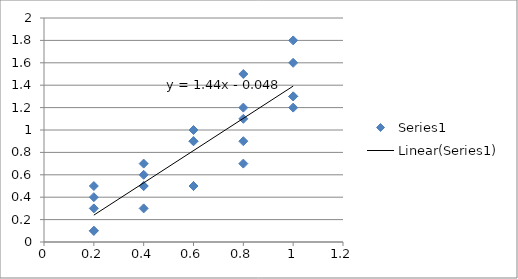
| Category | Series 0 |
|---|---|
| 0.2 | 0.4 |
| 0.4 | 0.3 |
| 0.6000000000000001 | 0.9 |
| 0.8 | 1.1 |
| 1.0 | 1.3 |
| 0.2 | 0.5 |
| 0.4 | 0.5 |
| 0.6000000000000001 | 1 |
| 0.8 | 1.2 |
| 1.0 | 1.2 |
| 0.2 | 0.1 |
| 0.4 | 0.6 |
| 0.6000000000000001 | 0.5 |
| 0.8 | 1.5 |
| 1.0 | 1.6 |
| 0.2 | 0.1 |
| 0.4 | 0.5 |
| 0.6000000000000001 | 0.9 |
| 0.8 | 0.7 |
| 1.0 | 1.3 |
| 0.2 | 0.3 |
| 0.4 | 0.7 |
| 0.6000000000000001 | 0.5 |
| 0.8 | 0.9 |
| 1.0 | 1.8 |